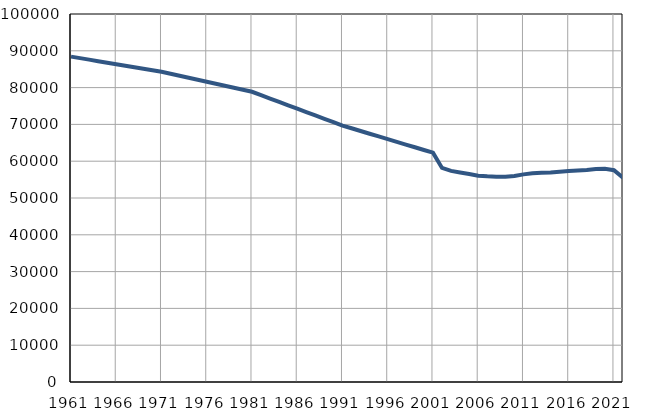
| Category | Број
становника |
|---|---|
| 1961.0 | 88422 |
| 1962.0 | 88009 |
| 1963.0 | 87596 |
| 1964.0 | 87183 |
| 1965.0 | 86770 |
| 1966.0 | 86356 |
| 1967.0 | 85943 |
| 1968.0 | 85530 |
| 1969.0 | 85117 |
| 1970.0 | 84704 |
| 1971.0 | 84291 |
| 1972.0 | 83748 |
| 1973.0 | 83205 |
| 1974.0 | 82662 |
| 1975.0 | 82119 |
| 1976.0 | 81576 |
| 1977.0 | 81034 |
| 1978.0 | 80491 |
| 1979.0 | 79948 |
| 1980.0 | 79404 |
| 1981.0 | 78862 |
| 1982.0 | 77944 |
| 1983.0 | 77026 |
| 1984.0 | 76107 |
| 1985.0 | 75189 |
| 1986.0 | 74271 |
| 1987.0 | 73353 |
| 1988.0 | 72435 |
| 1989.0 | 71516 |
| 1990.0 | 70598 |
| 1991.0 | 69680 |
| 1992.0 | 68943 |
| 1993.0 | 68207 |
| 1994.0 | 67470 |
| 1995.0 | 66733 |
| 1996.0 | 65996 |
| 1997.0 | 65260 |
| 1998.0 | 64523 |
| 1999.0 | 63786 |
| 2000.0 | 63049 |
| 2001.0 | 62313 |
| 2002.0 | 58166 |
| 2003.0 | 57365 |
| 2004.0 | 56923 |
| 2005.0 | 56499 |
| 2006.0 | 56053 |
| 2007.0 | 55880 |
| 2008.0 | 55767 |
| 2009.0 | 55761 |
| 2010.0 | 55962 |
| 2011.0 | 56417 |
| 2012.0 | 56698 |
| 2013.0 | 56854 |
| 2014.0 | 56922 |
| 2015.0 | 57130 |
| 2016.0 | 57343 |
| 2017.0 | 57483 |
| 2018.0 | 57607 |
| 2019.0 | 57856 |
| 2020.0 | 57962 |
| 2021.0 | 57563 |
| 2022.0 | 55477 |